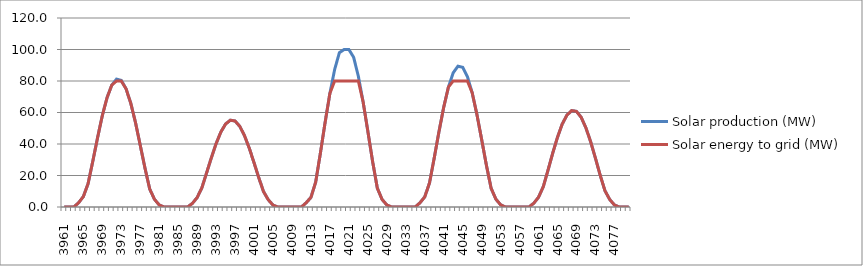
| Category | Solar production (MW) | Solar energy to grid (MW) |
|---|---|---|
| 3961.0 | 0 | 0 |
| 3962.0 | 0 | 0 |
| 3963.0 | 0 | 0 |
| 3964.0 | 2.7 | 2.7 |
| 3965.0 | 6.6 | 6.6 |
| 3966.0 | 14.8 | 14.8 |
| 3967.0 | 29.1 | 29.1 |
| 3968.0 | 44 | 44 |
| 3969.0 | 58 | 58 |
| 3970.0 | 69.4 | 69.4 |
| 3971.0 | 77.4 | 77.4 |
| 3972.0 | 81.2 | 80 |
| 3973.0 | 80.4 | 80 |
| 3974.0 | 75.1 | 75.1 |
| 3975.0 | 65.9 | 65.9 |
| 3976.0 | 53.6 | 53.6 |
| 3977.0 | 39.2 | 39.2 |
| 3978.0 | 24.7 | 24.7 |
| 3979.0 | 11.4 | 11.4 |
| 3980.0 | 4.9 | 4.9 |
| 3981.0 | 1.3 | 1.3 |
| 3982.0 | 0 | 0 |
| 3983.0 | 0 | 0 |
| 3984.0 | 0 | 0 |
| 3985.0 | 0 | 0 |
| 3986.0 | 0 | 0 |
| 3987.0 | 0 | 0 |
| 3988.0 | 2.3 | 2.3 |
| 3989.0 | 6 | 6 |
| 3990.0 | 12.2 | 12.2 |
| 3991.0 | 21.7 | 21.7 |
| 3992.0 | 31.3 | 31.3 |
| 3993.0 | 40.2 | 40.2 |
| 3994.0 | 47.6 | 47.6 |
| 3995.0 | 52.7 | 52.7 |
| 3996.0 | 55.1 | 55.1 |
| 3997.0 | 54.6 | 54.6 |
| 3998.0 | 51.2 | 51.2 |
| 3999.0 | 45.2 | 45.2 |
| 4000.0 | 37.3 | 37.3 |
| 4001.0 | 28.1 | 28.1 |
| 4002.0 | 18.6 | 18.6 |
| 4003.0 | 9.8 | 9.8 |
| 4004.0 | 4.6 | 4.6 |
| 4005.0 | 1.2 | 1.2 |
| 4006.0 | 0 | 0 |
| 4007.0 | 0 | 0 |
| 4008.0 | 0 | 0 |
| 4009.0 | 0 | 0 |
| 4010.0 | 0 | 0 |
| 4011.0 | 0 | 0 |
| 4012.0 | 2.7 | 2.7 |
| 4013.0 | 6.1 | 6.1 |
| 4014.0 | 15.8 | 15.8 |
| 4015.0 | 34.3 | 34.3 |
| 4016.0 | 53.9 | 53.9 |
| 4017.0 | 72.2 | 72.2 |
| 4018.0 | 87.3 | 80 |
| 4019.0 | 98 | 80 |
| 4020.0 | 100 | 80 |
| 4021.0 | 100 | 80 |
| 4022.0 | 95.1 | 80 |
| 4023.0 | 83 | 80 |
| 4024.0 | 66.8 | 66.8 |
| 4025.0 | 48.1 | 48.1 |
| 4026.0 | 29 | 29 |
| 4027.0 | 12 | 12 |
| 4028.0 | 4.8 | 4.8 |
| 4029.0 | 1.3 | 1.3 |
| 4030.0 | 0 | 0 |
| 4031.0 | 0 | 0 |
| 4032.0 | 0 | 0 |
| 4033.0 | 0 | 0 |
| 4034.0 | 0 | 0 |
| 4035.0 | 0 | 0 |
| 4036.0 | 2.7 | 2.7 |
| 4037.0 | 6.4 | 6.4 |
| 4038.0 | 15.2 | 15.2 |
| 4039.0 | 31.1 | 31.1 |
| 4040.0 | 47.8 | 47.8 |
| 4041.0 | 63.3 | 63.3 |
| 4042.0 | 76.2 | 76.2 |
| 4043.0 | 85.2 | 80 |
| 4044.0 | 89.4 | 80 |
| 4045.0 | 88.7 | 80 |
| 4046.0 | 82.8 | 80 |
| 4047.0 | 72.6 | 72.6 |
| 4048.0 | 58.8 | 58.8 |
| 4049.0 | 42.9 | 42.9 |
| 4050.0 | 26.6 | 26.6 |
| 4051.0 | 11.9 | 11.9 |
| 4052.0 | 5 | 5 |
| 4053.0 | 1.4 | 1.4 |
| 4054.0 | 0 | 0 |
| 4055.0 | 0 | 0 |
| 4056.0 | 0 | 0 |
| 4057.0 | 0 | 0 |
| 4058.0 | 0 | 0 |
| 4059.0 | 0 | 0 |
| 4060.0 | 2.4 | 2.4 |
| 4061.0 | 6.2 | 6.2 |
| 4062.0 | 12.9 | 12.9 |
| 4063.0 | 23.4 | 23.4 |
| 4064.0 | 34.3 | 34.3 |
| 4065.0 | 44.3 | 44.3 |
| 4066.0 | 52.7 | 52.7 |
| 4067.0 | 58.4 | 58.4 |
| 4068.0 | 61.2 | 61.2 |
| 4069.0 | 60.7 | 60.7 |
| 4070.0 | 56.9 | 56.9 |
| 4071.0 | 50.2 | 50.2 |
| 4072.0 | 41.3 | 41.3 |
| 4073.0 | 31 | 31 |
| 4074.0 | 20.2 | 20.2 |
| 4075.0 | 10.4 | 10.4 |
| 4076.0 | 4.8 | 4.8 |
| 4077.0 | 1.3 | 1.3 |
| 4078.0 | 0 | 0 |
| 4079.0 | 0 | 0 |
| 4080.0 | 0 | 0 |